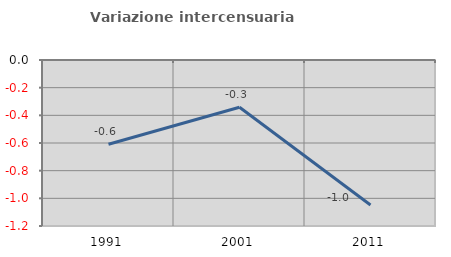
| Category | Variazione intercensuaria annua |
|---|---|
| 1991.0 | -0.609 |
| 2001.0 | -0.341 |
| 2011.0 | -1.048 |